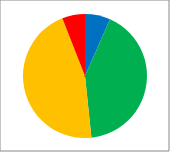
| Category | Count | % |
|---|---|---|
| Outstanding | 10 | 0.066 |
| Good | 63 | 0.417 |
| RI | 69 | 0.457 |
| Inadequate | 9 | 0.06 |